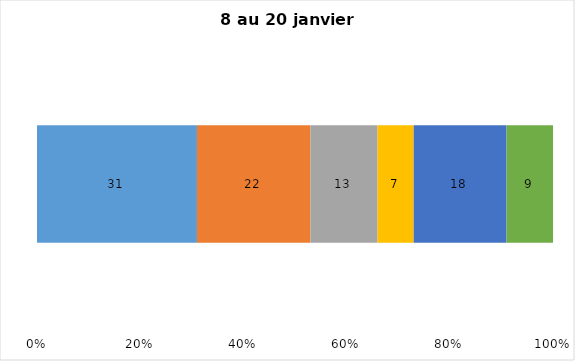
| Category | Plusieurs fois par jour | Une fois par jour | Quelques fois par semaine   | Une fois par semaine ou moins   |  Jamais   |  Je n’utilise pas les médias sociaux |
|---|---|---|---|---|---|---|
| 0 | 31 | 22 | 13 | 7 | 18 | 9 |